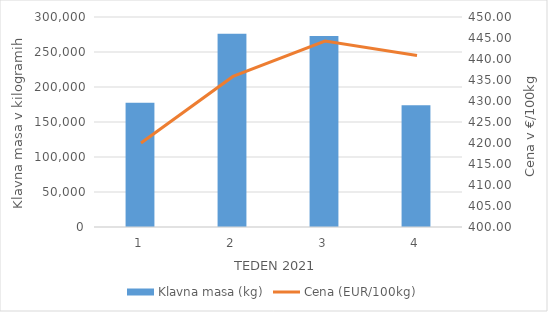
| Category | Klavna masa (kg) |
|---|---|
| 1.0 | 177573 |
| 2.0 | 275951 |
| 3.0 | 272797 |
| 4.0 | 174056 |